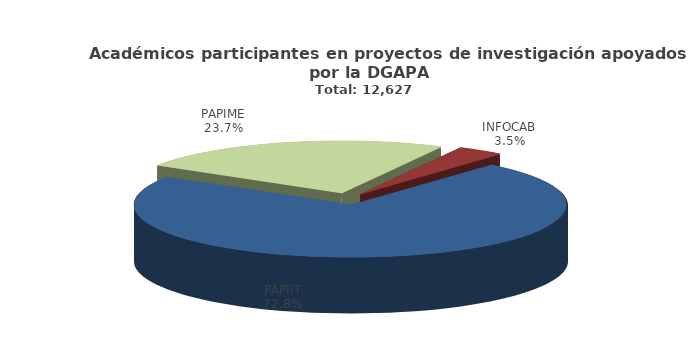
| Category | Series 0 |
|---|---|
| PAPIIT | 9191 |
| PAPIME | 2993 |
| INFOCAB | 443 |